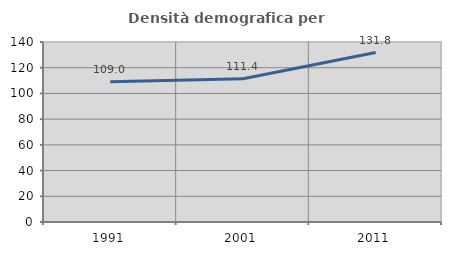
| Category | Densità demografica |
|---|---|
| 1991.0 | 109.013 |
| 2001.0 | 111.352 |
| 2011.0 | 131.787 |